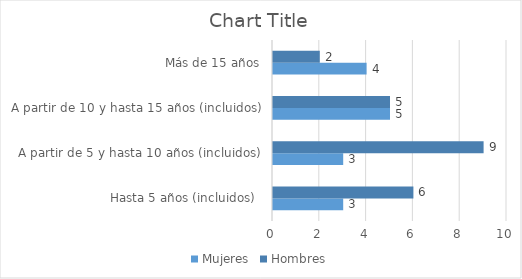
| Category | Mujeres | Hombres |
|---|---|---|
| Hasta 5 años (incluidos)  | 3 | 6 |
| A partir de 5 y hasta 10 años (incluidos) | 3 | 9 |
| A partir de 10 y hasta 15 años (incluidos) | 5 | 5 |
| Más de 15 años | 4 | 2 |